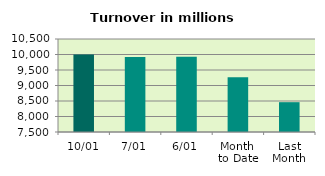
| Category | Series 0 |
|---|---|
| 10/01 | 10003.035 |
| 7/01 | 9918.646 |
| 6/01 | 9928.835 |
| Month 
to Date | 9269.921 |
| Last
Month | 8461.957 |